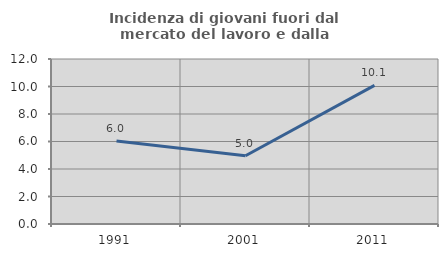
| Category | Incidenza di giovani fuori dal mercato del lavoro e dalla formazione  |
|---|---|
| 1991.0 | 6.044 |
| 2001.0 | 4.965 |
| 2011.0 | 10.084 |